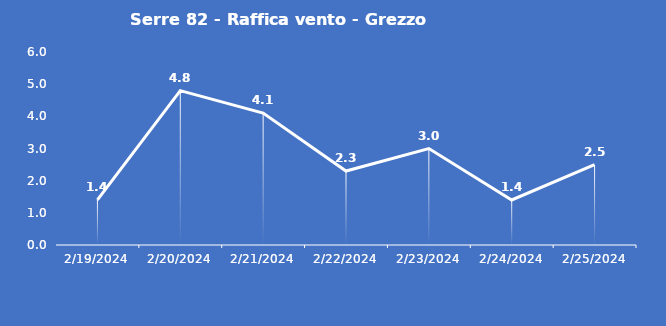
| Category | Serre 82 - Raffica vento - Grezzo (m/s) |
|---|---|
| 2/19/24 | 1.4 |
| 2/20/24 | 4.8 |
| 2/21/24 | 4.1 |
| 2/22/24 | 2.3 |
| 2/23/24 | 3 |
| 2/24/24 | 1.4 |
| 2/25/24 | 2.5 |